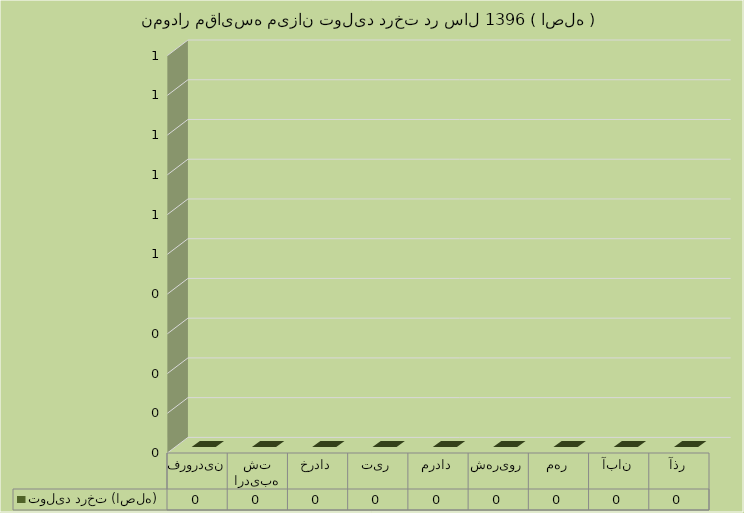
| Category | تولید درخت (اصله) |
|---|---|
| فروردین | 0 |
| اردیبهشت | 0 |
| خرداد | 0 |
| تیر | 0 |
| مرداد | 0 |
| شهریور | 0 |
| مهر | 0 |
| آبان | 0 |
| آذر | 0 |